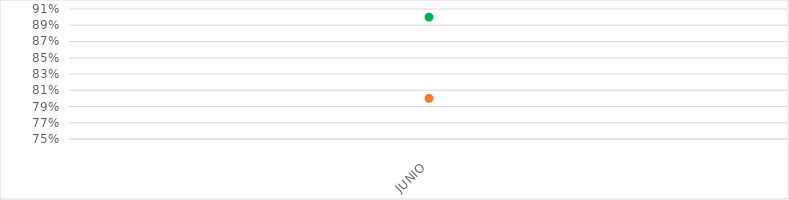
| Category | VALOR  | META PONDERADA |
|---|---|---|
| JUNIO | 0.8 | 0.9 |